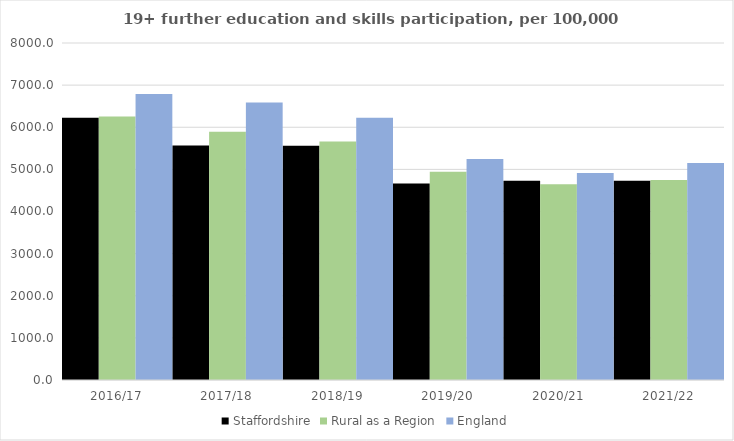
| Category | Staffordshire | Rural as a Region | England |
|---|---|---|---|
| 2016/17 | 6225.322 | 6253.401 | 6788 |
| 2017/18 | 5569.069 | 5892.029 | 6588 |
| 2018/19 | 5560.367 | 5661.873 | 6227 |
| 2019/20 | 4664.837 | 4943.801 | 5244 |
| 2020/21 | 4730.139 | 4646.727 | 4913 |
| 2021/22 | 4732.62 | 4747.049 | 5151 |